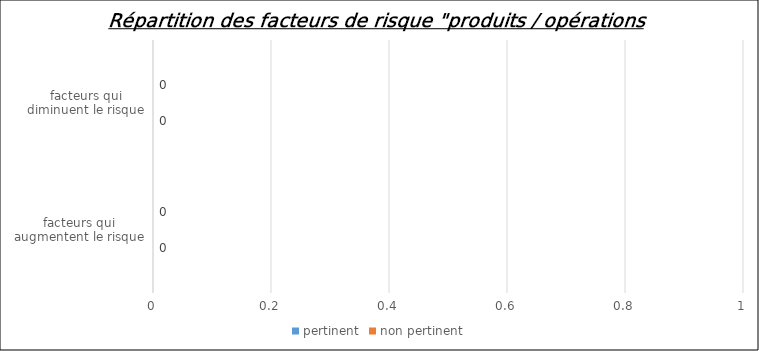
| Category | pertinent | non pertinent |
|---|---|---|
| facteurs qui augmentent le risque | 0 | 0 |
| facteurs qui diminuent le risque | 0 | 0 |